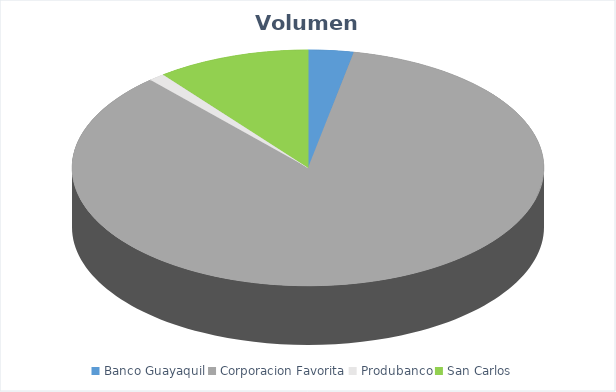
| Category | VOLUMEN ($USD) |
|---|---|
| Banco Guayaquil | 2875.84 |
| Corporacion Favorita | 79091.03 |
| Produbanco | 1039.14 |
| San Carlos | 9750 |